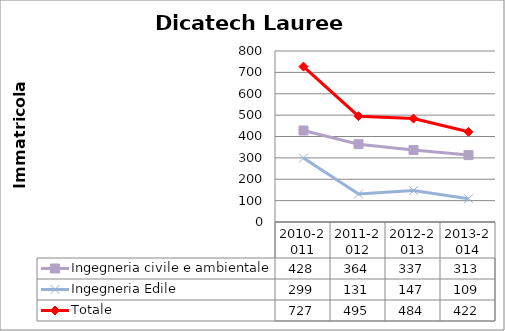
| Category | Ingegneria civile e ambientale | Ingegneria Edile | Totale |
|---|---|---|---|
| 2010-2011 | 428 | 299 | 727 |
| 2011-2012 | 364 | 131 | 495 |
| 2012-2013 | 337 | 147 | 484 |
| 2013-2014 | 313 | 109 | 422 |